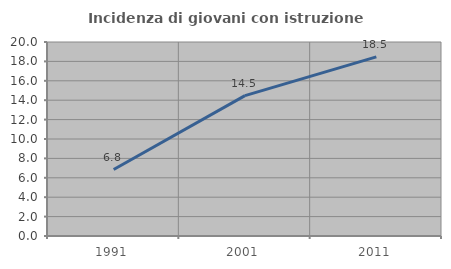
| Category | Incidenza di giovani con istruzione universitaria |
|---|---|
| 1991.0 | 6.849 |
| 2001.0 | 14.474 |
| 2011.0 | 18.462 |